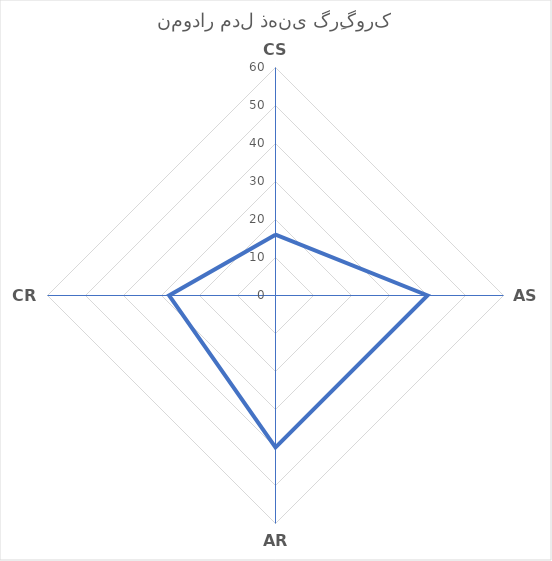
| Category | Series 0 |
|---|---|
| CS | 16 |
| AS | 40 |
| AR | 40 |
| CR | 28 |